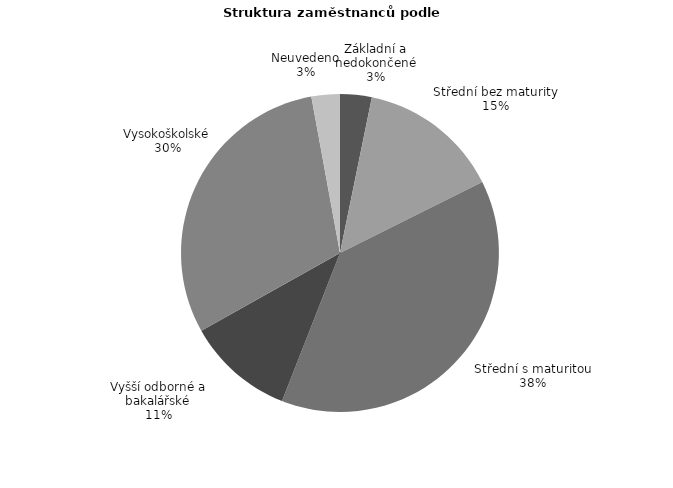
| Category | Series 0 |
|---|---|
| Základní a nedokončené | 20.401 |
| Střední bez maturity | 91.481 |
| Střední s maturitou | 242.978 |
| Vyšší odborné a bakalářské | 69.312 |
| Vysokoškolské | 191.859 |
| Neuvedeno | 18.323 |